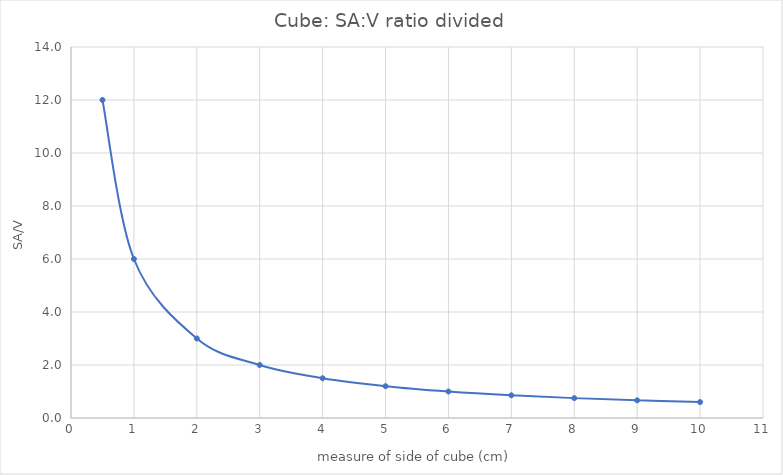
| Category | Series 0 |
|---|---|
| 0.5 | 12 |
| 1.0 | 6 |
| 2.0 | 3 |
| 3.0 | 2 |
| 4.0 | 1.5 |
| 5.0 | 1.2 |
| 6.0 | 1 |
| 7.0 | 0.857 |
| 8.0 | 0.75 |
| 9.0 | 0.667 |
| 10.0 | 0.6 |